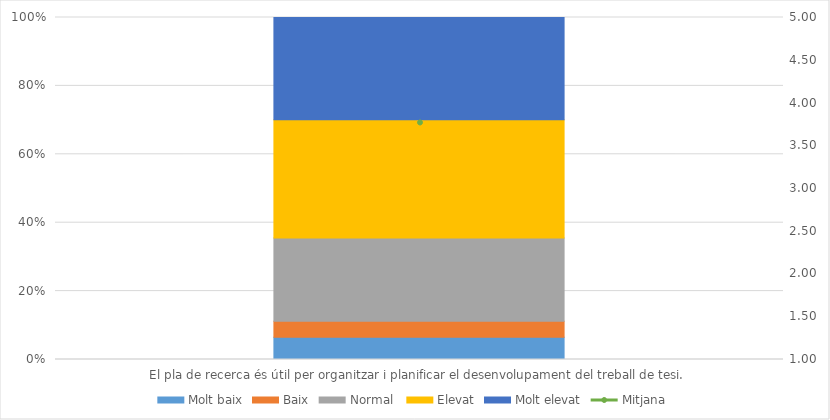
| Category | Molt baix | Baix | Normal  | Elevat | Molt elevat |
|---|---|---|---|---|---|
| El pla de recerca és útil per organitzar i planificar el desenvolupament del treball de tesi. | 7 | 5 | 26 | 37 | 32 |